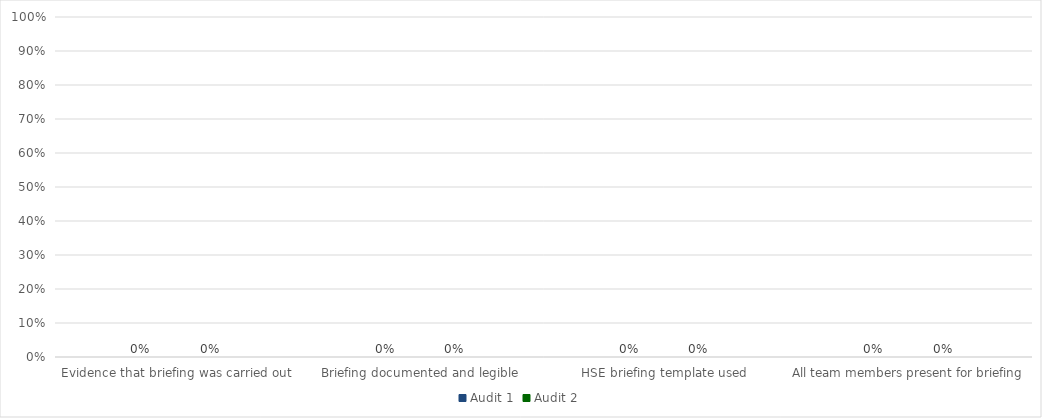
| Category | Audit 1 | Audit 2 |
|---|---|---|
| Evidence that briefing was carried out | 0 | 0 |
| Briefing documented and legible | 0 | 0 |
| HSE briefing template used | 0 | 0 |
| All team members present for briefing | 0 | 0 |